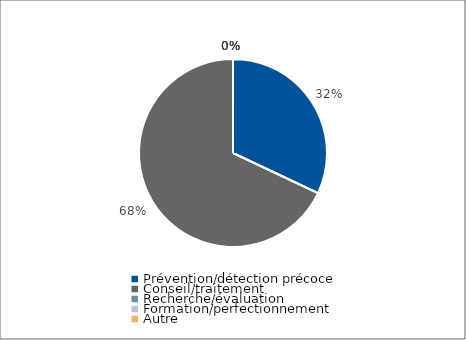
| Category | Series 0 |
|---|---|
| Prévention/détection précoce | 22098.1 |
| Conseil/traitement | 46927 |
| Recherche/évaluation | 0 |
| Formation/perfectionnement | 0 |
| Autre | 0 |